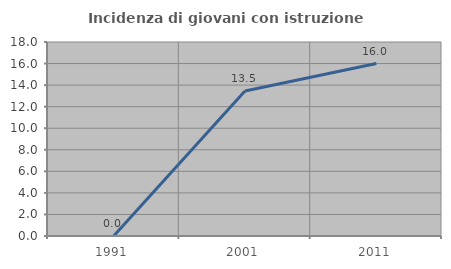
| Category | Incidenza di giovani con istruzione universitaria |
|---|---|
| 1991.0 | 0 |
| 2001.0 | 13.462 |
| 2011.0 | 16 |